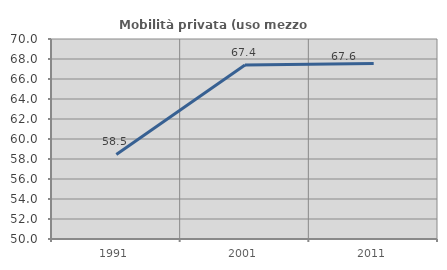
| Category | Mobilità privata (uso mezzo privato) |
|---|---|
| 1991.0 | 58.455 |
| 2001.0 | 67.409 |
| 2011.0 | 67.55 |